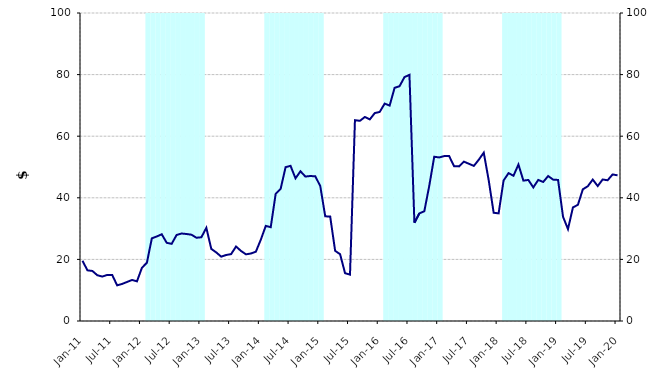
| Category | Series 1 |
|---|---|
| 0 | 0 |
| 1900-01-01 | 0 |
| 1900-01-02 | 0 |
| 1900-01-03 | 0 |
| 1900-01-04 | 0 |
| 1900-01-05 | 0 |
| 1900-01-06 | 0 |
| 1900-01-07 | 0 |
| 1900-01-08 | 0 |
| 1900-01-09 | 0 |
| 1900-01-10 | 0 |
| 1900-01-11 | 0 |
| 1900-01-12 | 0 |
| 1900-01-13 | 100000000 |
| 1900-01-14 | 100000000 |
| 1900-01-15 | 100000000 |
| 1900-01-16 | 100000000 |
| 1900-01-17 | 100000000 |
| 1900-01-18 | 100000000 |
| 1900-01-19 | 100000000 |
| 1900-01-20 | 100000000 |
| 1900-01-21 | 100000000 |
| 1900-01-22 | 100000000 |
| 1900-01-23 | 100000000 |
| 1900-01-24 | 100000000 |
| 1900-01-25 | 0 |
| 1900-01-26 | 0 |
| 1900-01-27 | 0 |
| 1900-01-28 | 0 |
| 1900-01-29 | 0 |
| 1900-01-30 | 0 |
| 1900-01-31 | 0 |
| 1900-02-01 | 0 |
| 1900-02-02 | 0 |
| 1900-02-03 | 0 |
| 1900-02-04 | 0 |
| 1900-02-05 | 0 |
| 1900-02-06 | 100000000 |
| 1900-02-07 | 100000000 |
| 1900-02-08 | 100000000 |
| 1900-02-09 | 100000000 |
| 1900-02-10 | 100000000 |
| 1900-02-11 | 100000000 |
| 1900-02-12 | 100000000 |
| 1900-02-13 | 100000000 |
| 1900-02-14 | 100000000 |
| 1900-02-15 | 100000000 |
| 1900-02-16 | 100000000 |
| 1900-02-17 | 100000000 |
| 1900-02-18 | 0 |
| 1900-02-19 | 0 |
| 1900-02-20 | 0 |
| 1900-02-21 | 0 |
| 1900-02-22 | 0 |
| 1900-02-23 | 0 |
| 1900-02-24 | 0 |
| 1900-02-25 | 0 |
| 1900-02-26 | 0 |
| 1900-02-27 | 0 |
| 1900-02-28 | 0 |
| 1900-02-28 | 0 |
| 1900-03-01 | 100000000 |
| 1900-03-02 | 100000000 |
| 1900-03-03 | 100000000 |
| 1900-03-04 | 100000000 |
| 1900-03-05 | 100000000 |
| 1900-03-06 | 100000000 |
| 1900-03-07 | 100000000 |
| 1900-03-08 | 100000000 |
| 1900-03-09 | 100000000 |
| 1900-03-10 | 100000000 |
| 1900-03-11 | 100000000 |
| 1900-03-12 | 100000000 |
| 1900-03-13 | 0 |
| 1900-03-14 | 0 |
| 1900-03-15 | 0 |
| 1900-03-16 | 0 |
| 1900-03-17 | 0 |
| 1900-03-18 | 0 |
| 1900-03-19 | 0 |
| 1900-03-20 | 0 |
| 1900-03-21 | 0 |
| 1900-03-22 | 0 |
| 1900-03-23 | 0 |
| 1900-03-24 | 0 |
| 1900-03-25 | 100000000 |
| 1900-03-26 | 100000000 |
| 1900-03-27 | 100000000 |
| 1900-03-28 | 100000000 |
| 1900-03-29 | 100000000 |
| 1900-03-30 | 100000000 |
| 1900-03-31 | 100000000 |
| 1900-04-01 | 100000000 |
| 1900-04-02 | 100000000 |
| 1900-04-03 | 100000000 |
| 1900-04-04 | 100000000 |
| 1900-04-05 | 100000000 |
| 1900-04-06 | 0 |
| 1900-04-07 | 0 |
| 1900-04-08 | 0 |
| 1900-04-09 | 0 |
| 1900-04-10 | 0 |
| 1900-04-11 | 0 |
| 1900-04-12 | 0 |
| 1900-04-13 | 0 |
| 1900-04-14 | 0 |
| 1900-04-15 | 0 |
| 1900-04-16 | 0 |
| 1900-04-17 | 0 |